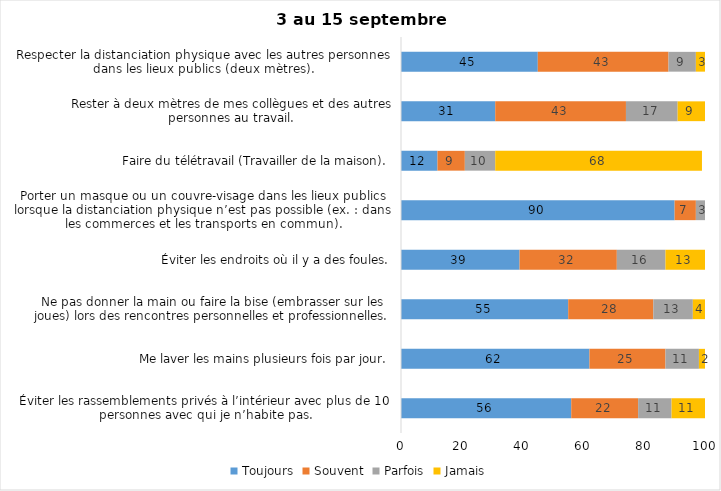
| Category | Toujours | Souvent | Parfois | Jamais |
|---|---|---|---|---|
| Éviter les rassemblements privés à l’intérieur avec plus de 10 personnes avec qui je n’habite pas. | 56 | 22 | 11 | 11 |
| Me laver les mains plusieurs fois par jour. | 62 | 25 | 11 | 2 |
| Ne pas donner la main ou faire la bise (embrasser sur les joues) lors des rencontres personnelles et professionnelles. | 55 | 28 | 13 | 4 |
| Éviter les endroits où il y a des foules. | 39 | 32 | 16 | 13 |
| Porter un masque ou un couvre-visage dans les lieux publics lorsque la distanciation physique n’est pas possible (ex. : dans les commerces et les transports en commun). | 90 | 7 | 3 | 0 |
| Faire du télétravail (Travailler de la maison). | 12 | 9 | 10 | 68 |
| Rester à deux mètres de mes collègues et des autres personnes au travail. | 31 | 43 | 17 | 9 |
| Respecter la distanciation physique avec les autres personnes dans les lieux publics (deux mètres). | 45 | 43 | 9 | 3 |